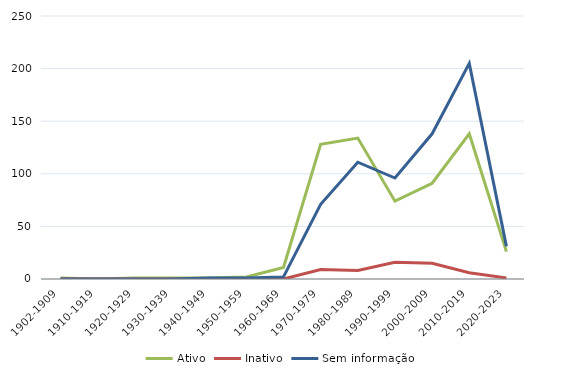
| Category | Ativo | Inativo | Sem informação |
|---|---|---|---|
| 1902-1909 | 1 | 0 | 0 |
| 1910-1919 | 0 | 0 | 0 |
| 1920-1929 | 1 | 0 | 0 |
| 1930-1939 | 1 | 0 | 0 |
| 1940-1949 | 1 | 0 | 1 |
| 1950-1959 | 2 | 0 | 1 |
| 1960-1969 | 11 | 0 | 2 |
| 1970-1979 | 128 | 9 | 71 |
| 1980-1989 | 134 | 8 | 111 |
| 1990-1999 | 74 | 16 | 96 |
| 2000-2009 | 91 | 15 | 138 |
| 2010-2019 | 138 | 6 | 205 |
| 2020-2023 | 26 | 1 | 31 |